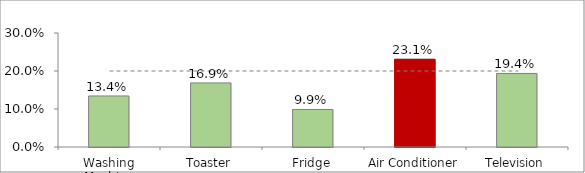
| Category | Series 0 |
|---|---|
| Washing Machine | 0.134 |
| Toaster | 0.169 |
| Fridge | 0.099 |
| Air Conditioner | 0.231 |
| Television | 0.194 |